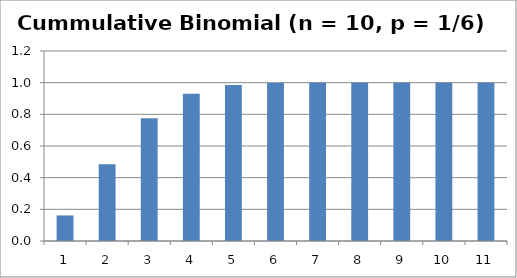
| Category | F(x) |
|---|---|
| 0 | 0.162 |
| 1 | 0.485 |
| 2 | 0.775 |
| 3 | 0.93 |
| 4 | 0.985 |
| 5 | 0.998 |
| 6 | 1 |
| 7 | 1 |
| 8 | 1 |
| 9 | 1 |
| 10 | 1 |